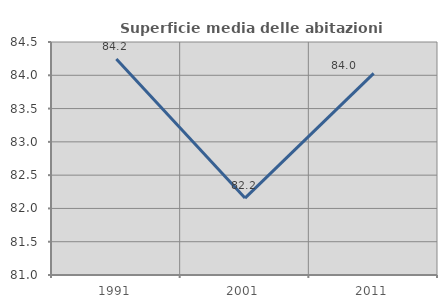
| Category | Superficie media delle abitazioni occupate |
|---|---|
| 1991.0 | 84.245 |
| 2001.0 | 82.155 |
| 2011.0 | 84.029 |